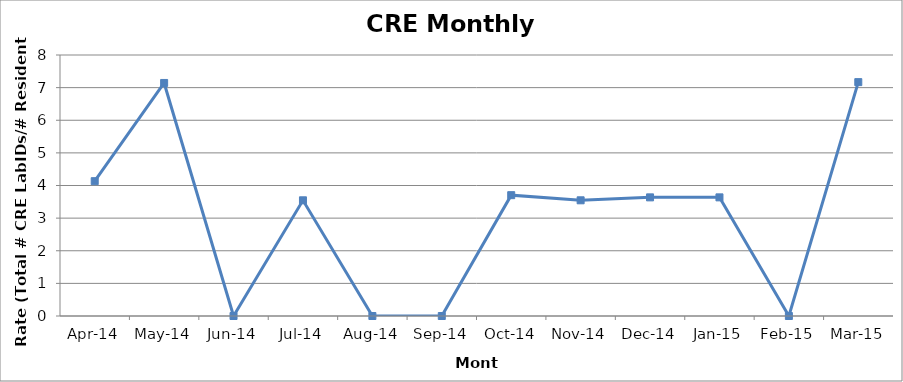
| Category | Series 2 |
|---|---|
| 2014-04-01 | 4.132 |
| 2014-05-01 | 7.143 |
| 2014-06-01 | 0 |
| 2014-07-01 | 3.546 |
| 2014-08-01 | 0 |
| 2014-09-01 | 0 |
| 2014-10-01 | 3.704 |
| 2014-11-01 | 3.546 |
| 2014-12-01 | 3.636 |
| 2015-01-01 | 3.636 |
| 2015-02-01 | 0 |
| 2015-03-01 | 7.168 |